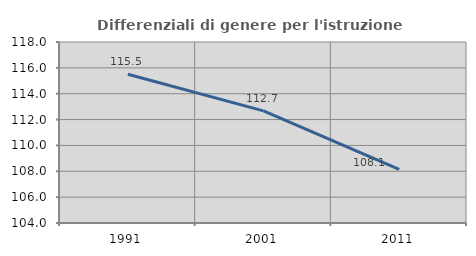
| Category | Differenziali di genere per l'istruzione superiore |
|---|---|
| 1991.0 | 115.506 |
| 2001.0 | 112.674 |
| 2011.0 | 108.14 |